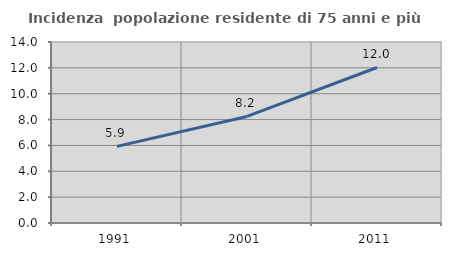
| Category | Incidenza  popolazione residente di 75 anni e più |
|---|---|
| 1991.0 | 5.928 |
| 2001.0 | 8.242 |
| 2011.0 | 12.028 |